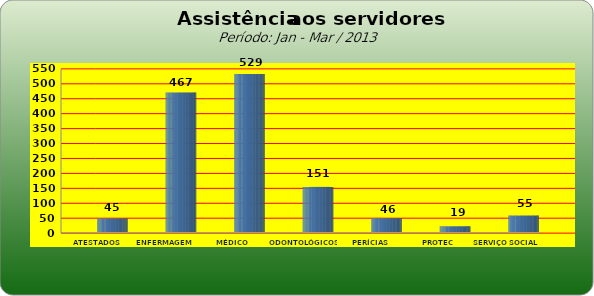
| Category | Series 0 |
|---|---|
| ATESTADOS MÉDICOS | 45 |
| ENFERMAGEM | 467 |
| MÉDICO | 529 |
| ODONTOLÓGICOS | 151 |
| PERÍCIAS MÉDICAS | 46 |
| PROTEC | 19 |
| SERVIÇO SOCIAL | 55 |